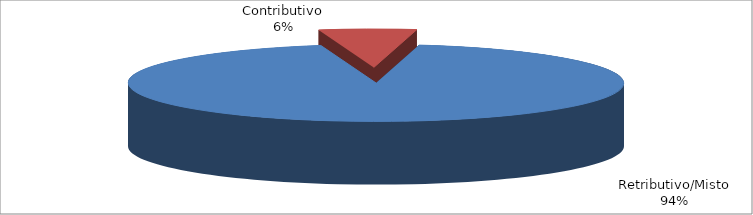
| Category | Decorrenti gennaio - marzo 2020 |
|---|---|
| Retributivo/Misto | 81919 |
| Contributivo | 5553 |